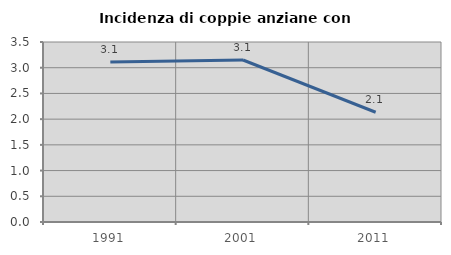
| Category | Incidenza di coppie anziane con figli |
|---|---|
| 1991.0 | 3.109 |
| 2001.0 | 3.15 |
| 2011.0 | 2.134 |